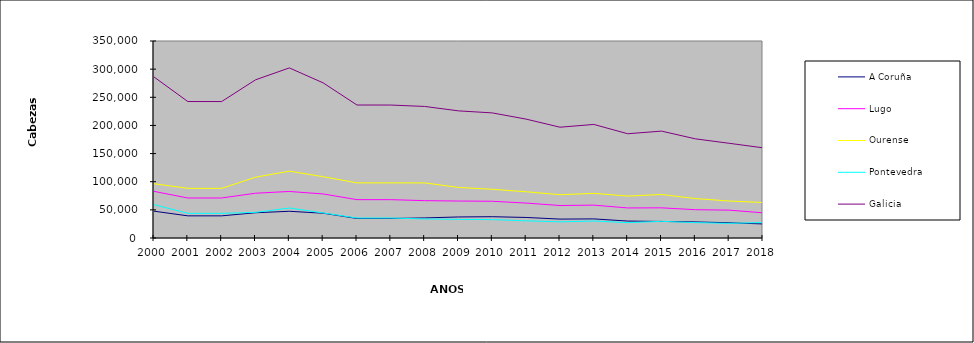
| Category | A Coruña | Lugo | Ourense | Pontevedra | Galicia |
|---|---|---|---|---|---|
| 2000.0 | 47647 | 82874 | 96368 | 59195 | 286084 |
| 2001.0 | 39355 | 71070 | 88244 | 43763 | 242432 |
| 2002.0 | 39355 | 71070 | 88244 | 43763 | 242432 |
| 2003.0 | 44848 | 79551 | 108051 | 45558 | 281008 |
| 2004.0 | 47483 | 82673 | 118783 | 53241 | 302180 |
| 2005.0 | 44027 | 78242 | 108849 | 44497 | 275615 |
| 2006.0 | 34696 | 68137 | 97964 | 35455 | 236252 |
| 2007.0 | 34697 | 68108 | 97964 | 35455 | 236224 |
| 2008.0 | 35656 | 66366 | 97844 | 33860 | 233726 |
| 2009.0 | 37370 | 65669 | 89813 | 33027 | 225879 |
| 2010.0 | 37818 | 65254 | 86480 | 32698 | 222250 |
| 2011.0 | 36502 | 62073 | 82125 | 30498 | 211198 |
| 2012.0 | 33575 | 57663 | 76885 | 28715 | 196838 |
| 2013.0 | 33935 | 58387 | 79313 | 30152 | 201787 |
| 2014.0 | 30076 | 53406 | 74497 | 27257 | 185236 |
| 2015.0 | 29417 | 53599 | 77267 | 29619 | 189902 |
| 2016.0 | 28568 | 50289 | 70029 | 27303 | 176189 |
| 2017.0 | 27054 | 49485 | 65696 | 26037 | 168272 |
| 2018.0 | 24969 | 44728 | 63037 | 27483 | 160217 |